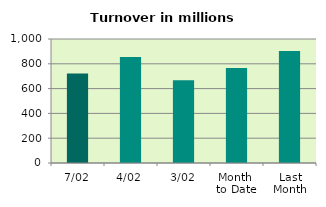
| Category | Series 0 |
|---|---|
| 7/02 | 722.2 |
| 4/02 | 855.228 |
| 3/02 | 666.777 |
| Month 
to Date | 765.943 |
| Last
Month | 902.557 |